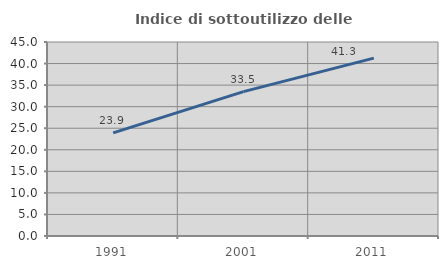
| Category | Indice di sottoutilizzo delle abitazioni  |
|---|---|
| 1991.0 | 23.91 |
| 2001.0 | 33.483 |
| 2011.0 | 41.258 |